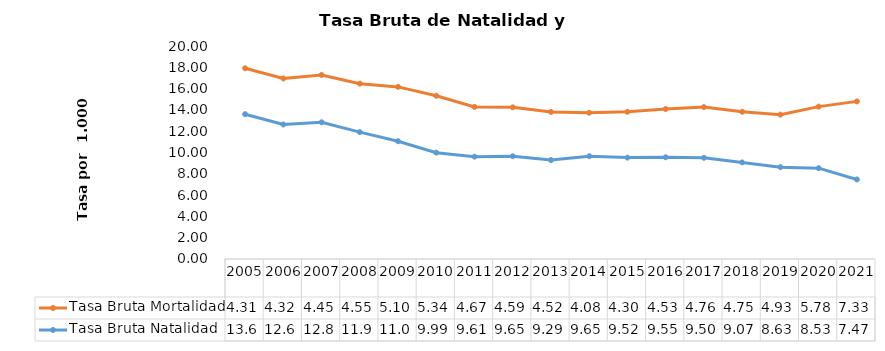
| Category | Tasa Bruta Natalidad | Tasa Bruta Mortalidad |
|---|---|---|
| 2005 | 13.597 | 4.311 |
| 2006 | 12.631 | 4.322 |
| 2007 | 12.836 | 4.445 |
| 2008 | 11.914 | 4.551 |
| 2009 | 11.059 | 5.102 |
| 2010 | 9.986 | 5.338 |
| 2011 | 9.611 | 4.672 |
| 2012 | 9.651 | 4.592 |
| 2013 | 9.291 | 4.517 |
| 2014 | 9.653 | 4.079 |
| 2015 | 9.52 | 4.301 |
| 2016 | 9.553 | 4.529 |
| 2017 | 9.503 | 4.76 |
| 2018 | 9.068 | 4.752 |
| 2019 | 8.626 | 4.93 |
| 2020 | 8.528 | 5.779 |
| 2021 | 7.47 | 7.33 |